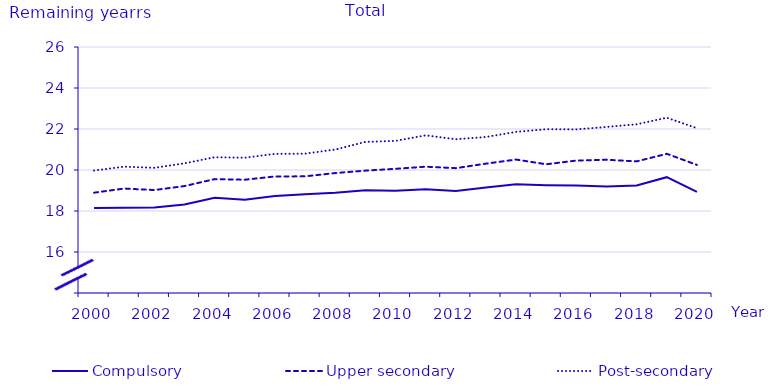
| Category | Compulsory | Upper secondary | Post-secondary |
|---|---|---|---|
| 2000.0 | 18.146 | 18.893 | 19.974 |
| 2001.0 | 18.158 | 19.096 | 20.164 |
| 2002.0 | 18.167 | 19.022 | 20.105 |
| 2003.0 | 18.318 | 19.216 | 20.325 |
| 2004.0 | 18.646 | 19.555 | 20.623 |
| 2005.0 | 18.552 | 19.526 | 20.6 |
| 2006.0 | 18.73 | 19.685 | 20.787 |
| 2007.0 | 18.817 | 19.691 | 20.798 |
| 2008.0 | 18.885 | 19.85 | 20.999 |
| 2009.0 | 19.016 | 19.969 | 21.369 |
| 2010.0 | 18.989 | 20.058 | 21.422 |
| 2011.0 | 19.066 | 20.161 | 21.69 |
| 2012.0 | 18.98 | 20.09 | 21.5 |
| 2013.0 | 19.15 | 20.31 | 21.61 |
| 2014.0 | 19.31 | 20.51 | 21.86 |
| 2015.0 | 19.26 | 20.28 | 21.99 |
| 2016.0 | 19.24 | 20.46 | 21.98 |
| 2017.0 | 19.2 | 20.5 | 22.1 |
| 2018.0 | 19.24 | 20.42 | 22.23 |
| 2019.0 | 19.65 | 20.79 | 22.55 |
| 2020.0 | 18.93 | 20.25 | 22.04 |